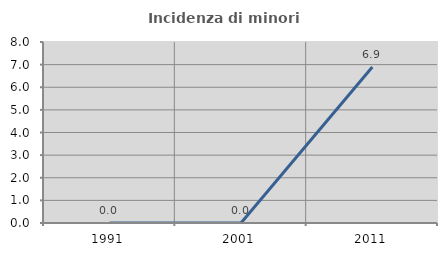
| Category | Incidenza di minori stranieri |
|---|---|
| 1991.0 | 0 |
| 2001.0 | 0 |
| 2011.0 | 6.897 |